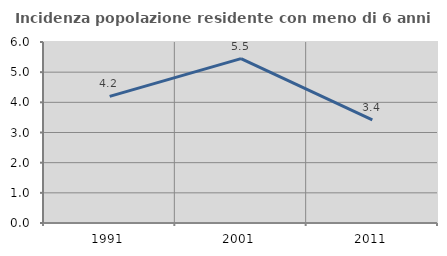
| Category | Incidenza popolazione residente con meno di 6 anni |
|---|---|
| 1991.0 | 4.197 |
| 2001.0 | 5.451 |
| 2011.0 | 3.417 |